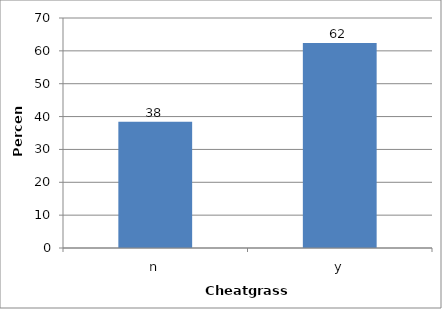
| Category | Average Fine Fuel Cover |
|---|---|
| n | 38.4 |
| y | 62.429 |